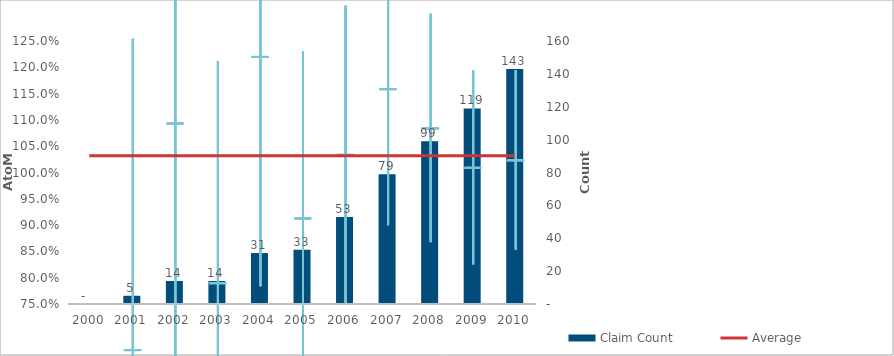
| Category | Claim Count |
|---|---|
| 0 | 0 |
| 1 | 5 |
| 2 | 14 |
| 3 | 14 |
| 4 | 31 |
| 5 | 33 |
| 6 | 53 |
| 7 | 79 |
| 8 | 99 |
| 9 | 119 |
| 10 | 143 |